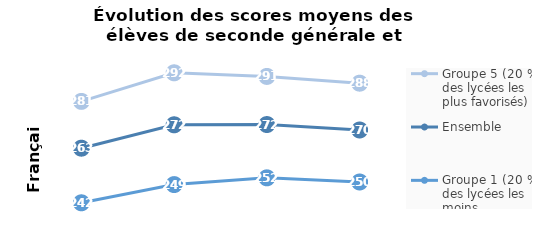
| Category | Groupe 5 (20 % des lycées les plus favorisés) | Ensemble | Groupe 1 (20 % des lycées les moins favorisés) |
|---|---|---|---|
| 2019.0 | 281 | 263 | 242 |
| 2020.0 | 292 | 272 | 249 |
| 2021.0 | 290.6 | 272.1 | 251.6 |
| 2022.0 | 288 | 270 | 250 |